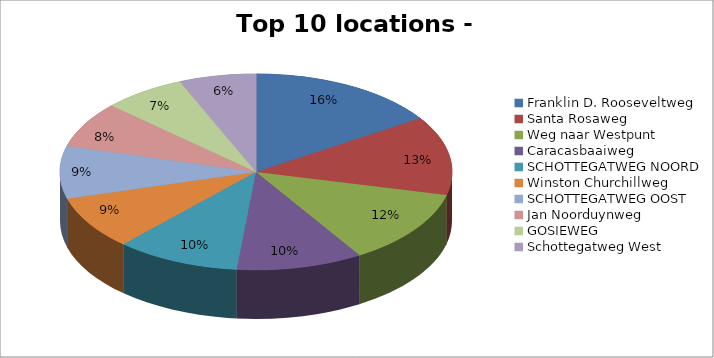
| Category | Series 0 |
|---|---|
| Franklin D. Rooseveltweg | 598 |
| Santa Rosaweg | 493 |
| Weg naar Westpunt | 468 |
| Caracasbaaiweg | 394 |
| SCHOTTEGATWEG NOORD | 387 |
| Winston Churchillweg | 333 |
| SCHOTTEGATWEG OOST | 329 |
| Jan Noorduynweg | 286 |
| GOSIEWEG | 259 |
| Schottegatweg West | 240 |